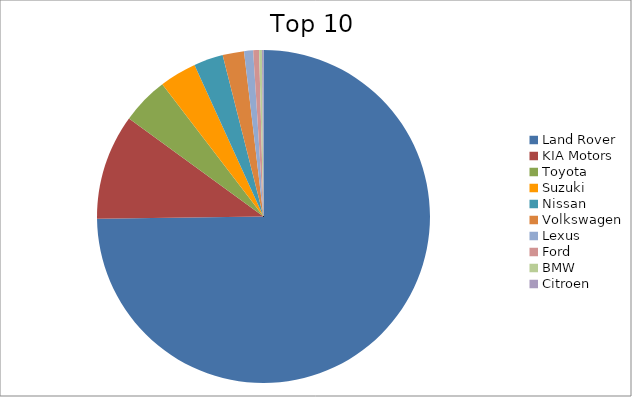
| Category | Series 0 |
|---|---|
| Land Rover | 74.78 |
| KIA Motors | 10.25 |
| Toyota | 4.57 |
| Suzuki | 3.6 |
| Nissan | 2.85 |
| Volkswagen | 2.08 |
| Lexus | 0.88 |
| Ford | 0.57 |
| BMW | 0.27 |
| Citroen | 0.15 |